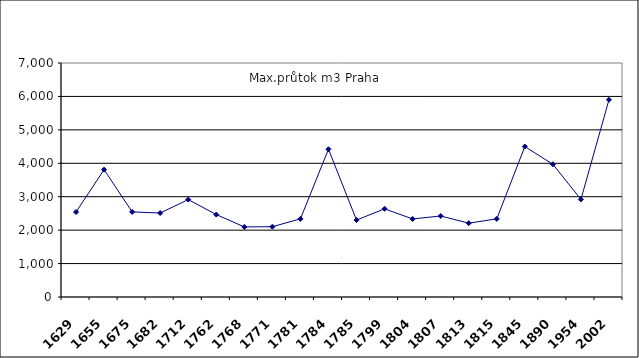
| Category | Max.průtok m3 Praha |
|---|---|
| 1629.0 | 2542 |
| 1655.0 | 3810 |
| 1675.0 | 2546 |
| 1682.0 | 2512 |
| 1712.0 | 2914 |
| 1762.0 | 2466 |
| 1768.0 | 2096 |
| 1771.0 | 2103 |
| 1781.0 | 2338 |
| 1784.0 | 4420 |
| 1785.0 | 2302 |
| 1799.0 | 2638 |
| 1804.0 | 2335 |
| 1807.0 | 2424 |
| 1813.0 | 2209 |
| 1815.0 | 2337 |
| 1845.0 | 4500 |
| 1890.0 | 3970 |
| 1954.0 | 2920 |
| 2002.0 | 5900 |